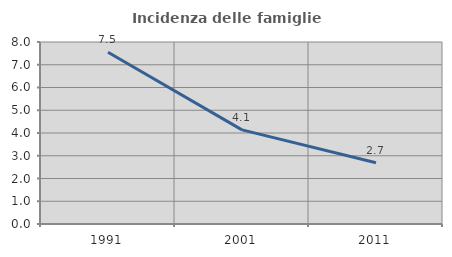
| Category | Incidenza delle famiglie numerose |
|---|---|
| 1991.0 | 7.546 |
| 2001.0 | 4.136 |
| 2011.0 | 2.689 |